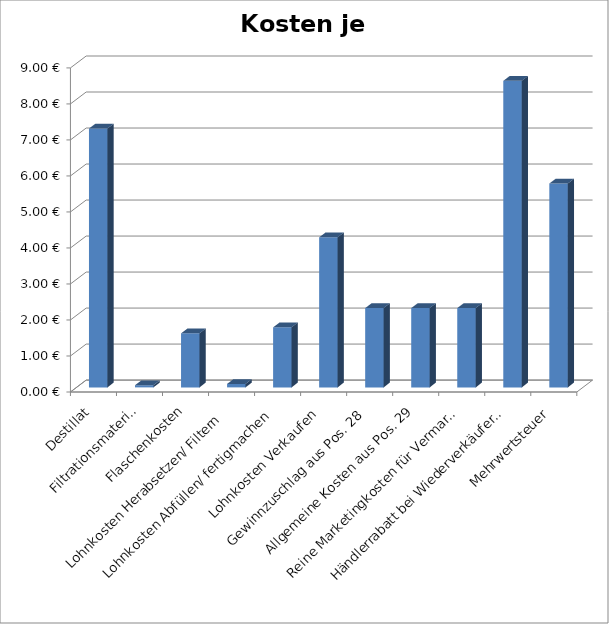
| Category | Kosten je Flasche |
|---|---|
| Destillat | 7.188 |
| Filtrationsmaterial | 0.06 |
| Flaschenkosten | 1.5 |
| Lohnkosten Herabsetzen/ Filtern  | 0.095 |
| Lohnkosten Abfüllen/ fertigmachen | 1.667 |
| Lohnkosten Verkaufen | 4.167 |
| Gewinnzuschlag aus Pos. 28 | 2.202 |
| Allgemeine Kosten aus Pos. 29 | 2.202 |
| Reine Marketingkosten für Vermarktung Pos.30 | 2.202 |
| Händlerrabatt bei Wiederverkäufer Pos 31 | 8.513 |
| Mehrwertsteuer | 5.661 |